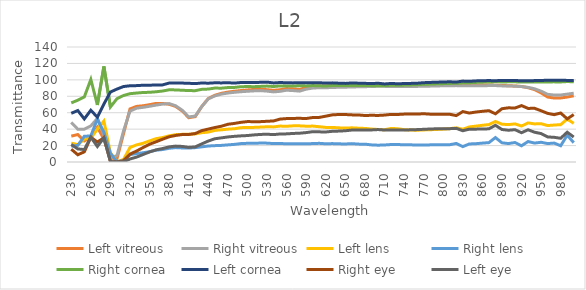
| Category | Left vitreous | Right vitreous | Left lens | Right lens | Right cornea | Left cornea | Right eye | Left eye |
|---|---|---|---|---|---|---|---|---|
| 230.0 | 31.485 | 48.184 | 23.004 | 19.085 | 71.978 | 59.293 | 15.585 | 21.335 |
| 240.0 | 33.458 | 39.948 | 21.077 | 20.263 | 75.214 | 62.633 | 8.817 | 15.922 |
| 250.0 | 25.645 | 39.976 | 27.893 | 31.311 | 79.232 | 52.42 | 12.385 | 15.16 |
| 260.0 | 30.026 | 43.944 | 28.98 | 31.754 | 100.485 | 62.994 | 30.172 | 30.172 |
| 270.0 | 42.335 | 53.064 | 40.004 | 52.445 | 69.502 | 54.576 | 24.261 | 18.845 |
| 280.0 | 28.022 | 33.037 | 49.877 | 36.258 | 116.386 | 70.534 | 29.451 | 29.451 |
| 290.0 | 4.765 | 5.187 | 11.361 | 10.691 | 66.942 | 85.173 | 0.574 | 0.574 |
| 300.0 | 3.844 | 7.702 | 0.345 | 0.324 | 77.055 | 88.777 | 0.053 | 0.059 |
| 310.0 | 34.253 | 37.662 | 3.044 | 1.784 | 80.928 | 91.854 | 1.327 | 0.277 |
| 320.0 | 64.595 | 61.887 | 17.664 | 8.874 | 83.176 | 92.811 | 9.601 | 3.655 |
| 330.0 | 67.686 | 65.509 | 20.831 | 10.325 | 83.946 | 92.982 | 13.326 | 5.963 |
| 340.0 | 68.438 | 66.558 | 22.814 | 11.228 | 84.606 | 93.433 | 17.567 | 9.076 |
| 350.0 | 69.807 | 67.827 | 25.657 | 12.572 | 84.859 | 93.498 | 21.627 | 12.249 |
| 360.0 | 71.351 | 69.263 | 28.399 | 14.375 | 85.507 | 93.756 | 24.621 | 14.798 |
| 370.0 | 71.252 | 70.486 | 29.799 | 15.191 | 86.397 | 93.886 | 27.765 | 16.391 |
| 380.0 | 70.307 | 71.089 | 31.849 | 16.688 | 87.922 | 96.117 | 30.683 | 18.378 |
| 390.0 | 67.608 | 68.438 | 33.297 | 17.531 | 87.761 | 96.294 | 32.322 | 19.351 |
| 400.0 | 62.116 | 63.023 | 33.667 | 17.128 | 87.337 | 96.073 | 33.404 | 18.958 |
| 410.0 | 53.963 | 54.916 | 33.69 | 16.924 | 86.956 | 95.83 | 33.497 | 17.762 |
| 420.0 | 55.22 | 55.911 | 34.261 | 17.498 | 86.836 | 95.411 | 34.658 | 18.399 |
| 430.0 | 67.577 | 67.562 | 35.703 | 18.467 | 88.45 | 96.206 | 38.221 | 22.05 |
| 440.0 | 77.304 | 76.825 | 36.425 | 19.467 | 88.777 | 95.94 | 40.077 | 25.533 |
| 450.0 | 81.227 | 80.445 | 38.459 | 19.911 | 90.012 | 96.427 | 41.966 | 28.301 |
| 460.0 | 83.58 | 82.661 | 39.228 | 20.207 | 89.867 | 96.294 | 43.521 | 29.383 |
| 470.0 | 85.075 | 83.965 | 39.976 | 20.84 | 90.636 | 96.516 | 45.941 | 30.493 |
| 480.0 | 86.139 | 84.84 | 40.486 | 21.454 | 90.761 | 96.073 | 46.946 | 31.239 |
| 490.0 | 86.956 | 85.566 | 41.783 | 22.408 | 91.685 | 96.761 | 48.306 | 31.805 |
| 500.0 | 87.74 | 86.099 | 42.092 | 22.751 | 91.833 | 96.805 | 49.215 | 32.218 |
| 510.0 | 88.328 | 86.596 | 42.131 | 22.798 | 91.706 | 96.65 | 49.068 | 32.984 |
| 520.0 | 88.654 | 86.896 | 42.501 | 23.057 | 92.045 | 97.006 | 49.136 | 33.558 |
| 530.0 | 88.044 | 86.278 | 42.894 | 22.967 | 92.406 | 97.23 | 49.568 | 33.822 |
| 540.0 | 87.297 | 85.349 | 42.737 | 22.413 | 91.876 | 96.25 | 49.969 | 33.327 |
| 550.0 | 87.963 | 86.04 | 43.712 | 22.408 | 92.619 | 96.783 | 52.252 | 34.119 |
| 560.0 | 89.392 | 87.378 | 43.511 | 22.32 | 92.363 | 96.427 | 52.857 | 34.245 |
| 570.0 | 89.064 | 86.936 | 44.025 | 22.192 | 92.491 | 96.316 | 53.064 | 34.762 |
| 580.0 | 88.288 | 86.278 | 44.005 | 22.09 | 92.832 | 96.583 | 53.174 | 35.059 |
| 590.0 | 90.803 | 88.675 | 43.581 | 22.192 | 92.64 | 96.361 | 52.942 | 35.793 |
| 600.0 | 92.109 | 89.991 | 43.702 | 22.418 | 93.046 | 96.605 | 54.138 | 36.906 |
| 610.0 | 92.47 | 90.448 | 42.964 | 22.725 | 92.747 | 96.494 | 54.275 | 36.703 |
| 620.0 | 92.47 | 90.344 | 42.092 | 22.187 | 92.512 | 96.095 | 55.783 | 36.543 |
| 630.0 | 92.854 | 90.782 | 42.111 | 22.403 | 93.068 | 96.339 | 57.372 | 37.368 |
| 640.0 | 92.897 | 90.887 | 41.572 | 22.121 | 93.068 | 95.962 | 57.836 | 37.61 |
| 650.0 | 93.132 | 91.096 | 41.362 | 21.938 | 93.132 | 95.697 | 57.796 | 38.045 |
| 660.0 | 93.368 | 91.285 | 41.591 | 22.367 | 93.197 | 96.25 | 57.372 | 38.878 |
| 670.0 | 93.498 | 91.559 | 41.162 | 21.762 | 93.261 | 95.984 | 57.266 | 39.048 |
| 680.0 | 93.627 | 91.706 | 40.851 | 21.707 | 93.068 | 95.786 | 56.585 | 38.86 |
| 690.0 | 93.799 | 91.876 | 40.105 | 20.845 | 92.961 | 95.455 | 56.859 | 39.03 |
| 700.0 | 93.886 | 92.151 | 39.61 | 20.469 | 92.854 | 95.896 | 56.676 | 39.482 |
| 710.0 | 93.951 | 92.066 | 39.255 | 20.711 | 92.897 | 95.017 | 57.122 | 38.931 |
| 720.0 | 93.864 | 92.024 | 40.87 | 21.267 | 93.411 | 95.609 | 57.97 | 38.967 |
| 730.0 | 93.691 | 91.939 | 40.458 | 21.311 | 93.347 | 95.28 | 57.85 | 39.066 |
| 740.0 | 93.584 | 91.854 | 39.418 | 20.912 | 93.584 | 95.477 | 58.304 | 38.824 |
| 750.0 | 93.627 | 91.96 | 38.931 | 20.874 | 93.843 | 95.697 | 58.385 | 39.192 |
| 760.0 | 93.735 | 92.045 | 38.672 | 20.763 | 94.124 | 95.94 | 58.385 | 39.437 |
| 770.0 | 93.778 | 92.193 | 39.066 | 20.587 | 94.602 | 96.561 | 58.749 | 39.783 |
| 780.0 | 93.929 | 92.363 | 39.319 | 20.869 | 94.864 | 96.872 | 58.224 | 40.17 |
| 790.0 | 94.037 | 92.619 | 39.61 | 20.965 | 95.148 | 97.163 | 57.983 | 40.448 |
| 800.0 | 94.254 | 92.726 | 40.05 | 20.98 | 95.411 | 97.409 | 58.05 | 40.467 |
| 810.0 | 94.297 | 92.939 | 40.57 | 21.047 | 95.697 | 97.634 | 58.103 | 40.588 |
| 820.0 | 94.254 | 92.982 | 41.553 | 22.553 | 95.786 | 97.32 | 56.507 | 40.935 |
| 830.0 | 93.929 | 92.811 | 39.912 | 18.724 | 96.405 | 98.492 | 61.39 | 38.072 |
| 840.0 | 93.735 | 92.854 | 42.678 | 21.963 | 96.538 | 98.197 | 59.58 | 39.958 |
| 850.0 | 93.627 | 92.832 | 43.631 | 22.289 | 96.895 | 98.742 | 60.828 | 39.994 |
| 860.0 | 93.67 | 92.875 | 44.658 | 22.972 | 97.208 | 98.946 | 61.688 | 40.151 |
| 870.0 | 93.648 | 93.004 | 45.52 | 23.583 | 97.387 | 99.129 | 62.474 | 40.383 |
| 880.0 | 93.541 | 93.046 | 49.34 | 29.737 | 97.589 | 98.924 | 58.681 | 44.668 |
| 890.0 | 93.175 | 92.662 | 46.004 | 23.356 | 97.521 | 99.357 | 64.878 | 39.573 |
| 900.0 | 92.875 | 92.512 | 45.53 | 22.423 | 97.544 | 99.289 | 65.963 | 38.672 |
| 910.0 | 92.534 | 92.3 | 46.409 | 23.73 | 97.589 | 99.106 | 65.72 | 39.346 |
| 920.0 | 91.96 | 91.812 | 43.732 | 19.747 | 97.364 | 99.015 | 68.659 | 35.645 |
| 930.0 | 90.448 | 90.866 | 47.577 | 24.923 | 97.477 | 98.901 | 65.253 | 39.264 |
| 940.0 | 88.105 | 89.146 | 46.366 | 23.041 | 97.454 | 99.083 | 65.343 | 36.233 |
| 950.0 | 84.101 | 86.218 | 46.612 | 23.999 | 97.409 | 99.22 | 62.402 | 34.626 |
| 960.0 | 79.104 | 82.414 | 44.351 | 22.413 | 97.521 | 99.563 | 59.17 | 30.507 |
| 970.0 | 77.857 | 81.508 | 45.009 | 23.041 | 97.544 | 99.563 | 57.637 | 30.047 |
| 980.0 | 77.983 | 81.583 | 45.467 | 19.788 | 97.477 | 99.563 | 59.621 | 28.887 |
| 990.0 | 79.068 | 82.623 | 52.264 | 32.599 | 97.926 | 99.334 | 52.493 | 36.258 |
| 1000.0 | 80.593 | 83.734 | 47.065 | 23.534 | 97.701 | 99.106 | 57.756 | 30.388 |